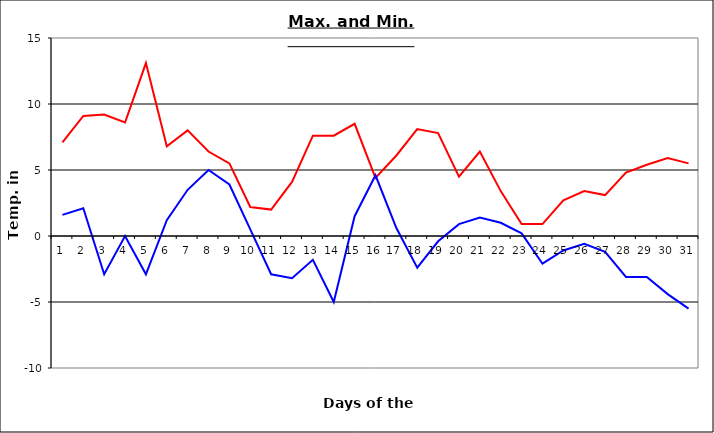
| Category | Series 0 | Series 1 |
|---|---|---|
| 0 | 7.1 | 1.6 |
| 1 | 9.1 | 2.1 |
| 2 | 9.2 | -2.9 |
| 3 | 8.6 | 0 |
| 4 | 13.1 | -2.9 |
| 5 | 6.8 | 1.2 |
| 6 | 8 | 3.5 |
| 7 | 6.4 | 5 |
| 8 | 5.5 | 3.9 |
| 9 | 2.2 | 0.5 |
| 10 | 2 | -2.9 |
| 11 | 4.1 | -3.2 |
| 12 | 7.6 | -1.8 |
| 13 | 7.6 | -5 |
| 14 | 8.5 | 1.5 |
| 15 | 4.4 | 4.6 |
| 16 | 6.1 | 0.6 |
| 17 | 8.1 | -2.4 |
| 18 | 7.8 | -0.4 |
| 19 | 4.5 | 0.9 |
| 20 | 6.4 | 1.4 |
| 21 | 3.4 | 1 |
| 22 | 0.9 | 0.2 |
| 23 | 0.9 | -2.1 |
| 24 | 2.7 | -1.1 |
| 25 | 3.4 | -0.6 |
| 26 | 3.1 | -1.2 |
| 27 | 4.8 | -3.1 |
| 28 | 5.4 | -3.1 |
| 29 | 5.9 | -4.4 |
| 30 | 5.5 | -5.5 |